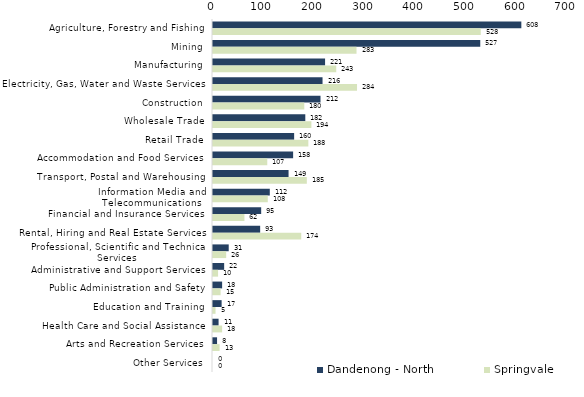
| Category | Dandenong - North | Springvale |
|---|---|---|
| Agriculture, Forestry and Fishing | 608 | 528 |
| Mining | 527 | 283 |
| Manufacturing | 221 | 243 |
| Electricity, Gas, Water and Waste Services | 216 | 284 |
| Construction | 212 | 180 |
| Wholesale Trade | 182 | 194 |
| Retail Trade | 160 | 188 |
| Accommodation and Food Services | 158 | 107 |
| Transport, Postal and Warehousing | 149 | 185 |
| Information Media and Telecommunications | 112 | 108 |
| Financial and Insurance Services | 95 | 62 |
| Rental, Hiring and Real Estate Services | 93 | 174 |
| Professional, Scientific and Technical Services | 31 | 26 |
| Administrative and Support Services | 22 | 10 |
| Public Administration and Safety | 18 | 15 |
| Education and Training | 17 | 5 |
| Health Care and Social Assistance | 11 | 18 |
| Arts and Recreation Services | 8 | 13 |
| Other Services | 0 | 0 |